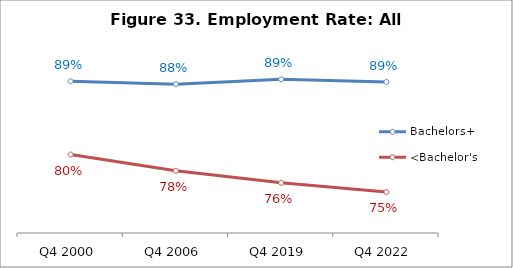
| Category | Bachelors+ | <Bachelor's |
|---|---|---|
| Q4 2000 | 0.888 | 0.797 |
| Q4 2006 | 0.884 | 0.777 |
| Q4 2019 | 0.89 | 0.762 |
| Q4 2022 | 0.887 | 0.751 |